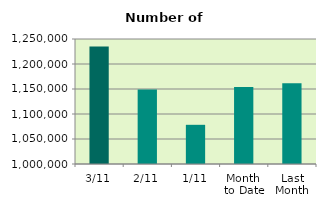
| Category | Series 0 |
|---|---|
| 3/11 | 1235128 |
| 2/11 | 1149194 |
| 1/11 | 1078380 |
| Month 
to Date | 1154234 |
| Last
Month | 1161301.714 |